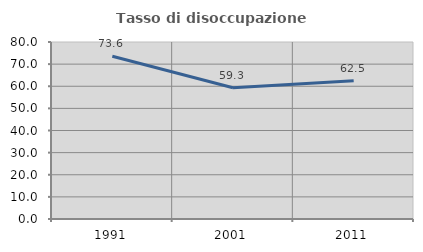
| Category | Tasso di disoccupazione giovanile  |
|---|---|
| 1991.0 | 73.593 |
| 2001.0 | 59.341 |
| 2011.0 | 62.5 |